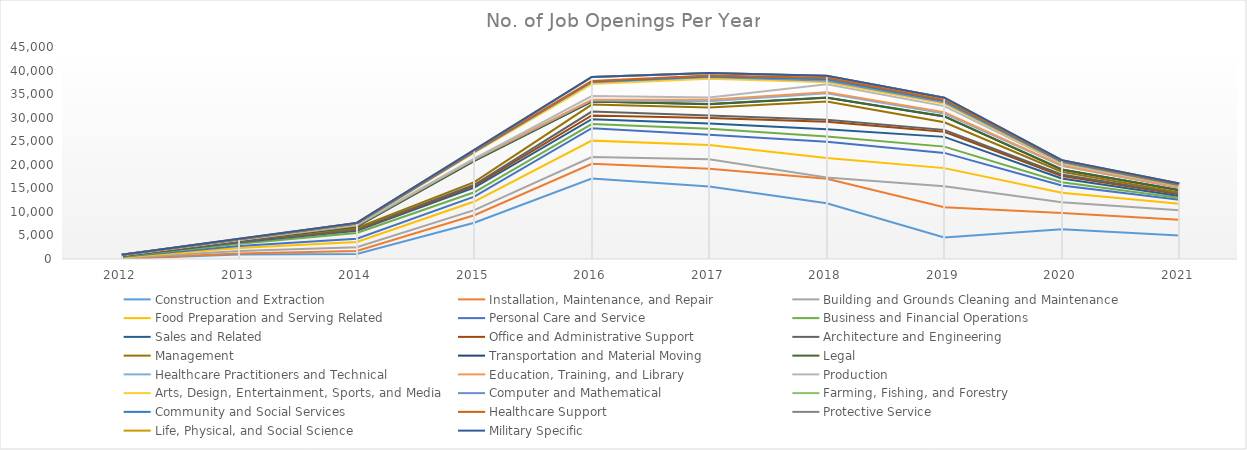
| Category | Construction and Extraction | Installation, Maintenance, and Repair | Building and Grounds Cleaning and Maintenance | Food Preparation and Serving Related | Personal Care and Service | Business and Financial Operations | Sales and Related | Office and Administrative Support | Architecture and Engineering | Management | Transportation and Material Moving | Legal | Healthcare Practitioners and Technical | Education, Training, and Library | Production | Arts, Design, Entertainment, Sports, and Media | Computer and Mathematical | Farming, Fishing, and Forestry | Community and Social Services | Healthcare Support | Protective Service | Life, Physical, and Social Science | Military Specific  |
|---|---|---|---|---|---|---|---|---|---|---|---|---|---|---|---|---|---|---|---|---|---|---|---|
| 2012 | 50 | 54 | 106 | 130 | 136 | 59 | 107 | 59 | 18 | 47 | 22 | 1 | 23 | 3 | 16 | 32 | 7 | 13 | 1 | 3 | 4 | 2 | 0 |
| 2013 | 976 | 180 | 520 | 635 | 461 | 451 | 347 | 117 | 44 | 251 | 20 | 4 | 34 | 15 | 42 | 50 | 21 | 20 | 2 | 7 | 58 | 21 | 0 |
| 2014 | 1083 | 622 | 789 | 1126 | 690 | 1211 | 462 | 150 | 122 | 330 | 302 | 4 | 209 | 91 | 105 | 117 | 43 | 52 | 14 | 53 | 80 | 14 | 0 |
| 2015 | 7709 | 1583 | 1074 | 1834 | 1023 | 947 | 961 | 389 | 238 | 569 | 4506 | 12 | 259 | 88 | 131 | 1263 | 131 | 68 | 9 | 84 | 253 | 28 | 3 |
| 2016 | 17089 | 3130 | 1437 | 3470 | 2643 | 873 | 1026 | 790 | 837 | 1491 | 646 | 23 | 204 | 165 | 769 | 2538 | 392 | 91 | 17 | 132 | 863 | 28 | 0 |
| 2017 | 15364 | 3767 | 2059 | 3025 | 2177 | 1233 | 1156 | 1154 | 541 | 1690 | 701 | 32 | 580 | 332 | 482 | 3979 | 336 | 114 | 38 | 198 | 514 | 12 | 2 |
| 2018 | 11831 | 5197 | 286 | 4124 | 3467 | 1120 | 1506 | 1581 | 443 | 3864 | 822 | 44 | 880 | 244 | 1670 | 461 | 275 | 295 | 26 | 316 | 418 | 32 | 0 |
| 2019 | 4549 | 6454 | 4429 | 3859 | 3231 | 1332 | 2069 | 1082 | 404 | 1619 | 1229 | 43 | 574 | 273 | 1302 | 528 | 293 | 252 | 38 | 202 | 457 | 27 | 0 |
| 2020 | 6331 | 3428 | 2268 | 2018 | 1544 | 710 | 791 | 536 | 315 | 584 | 467 | 20 | 750 | 89 | 429 | 190 | 88 | 87 | 19 | 163 | 155 | 9 | 0 |
| 2021 | 4993 | 3340 | 1996 | 1396 | 842 | 391 | 397 | 382 | 152 | 238 | 485 | 11 | 486 | 67 | 325 | 76 | 64 | 86 | 11 | 77 | 199 | 3 | 0 |